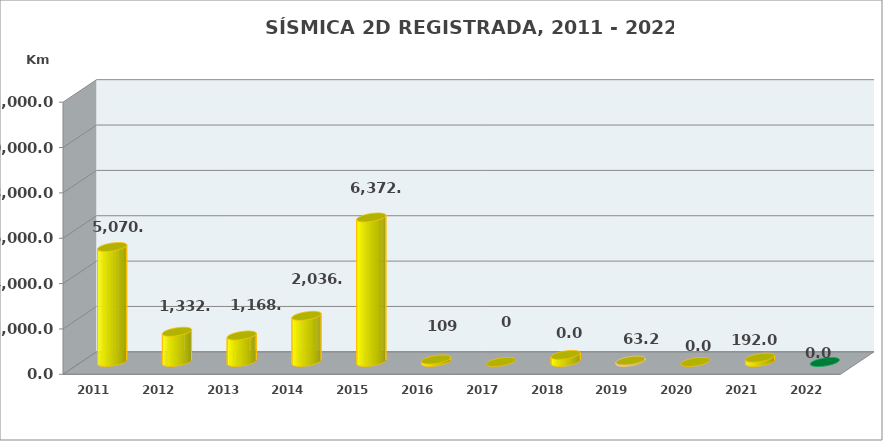
| Category | Series 0 |
|---|---|
| 2011.0 | 5070.18 |
| 2012.0 | 1332.85 |
| 2013.0 | 1168 |
| 2014.0 | 2036 |
| 2015.0 | 6372.61 |
| 2016.0 | 109 |
| 2017.0 | 0 |
| 2018.0 | 313.4 |
| 2019.0 | 63.22 |
| 2020.0 | 0 |
| 2021.0 | 191.95 |
| 2022.0 | 0 |